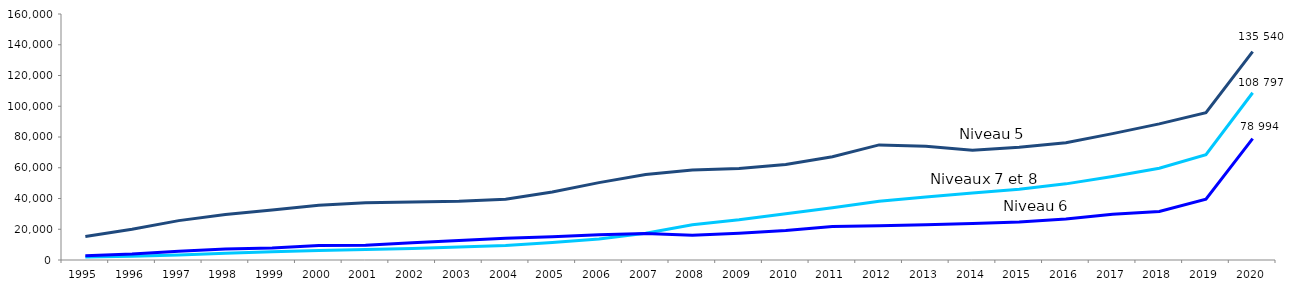
| Category | Niveaux 7 et 8 | Niveau 6 | Niveau 5 |
|---|---|---|---|
| 1995 | 1948 | 2829 | 15273 |
| 1996 | 2441 | 3916 | 19952 |
| 1997 | 3250 | 5768 | 25603 |
| 1998 | 4436 | 7143 | 29581 |
| 1999 | 5397 | 7780 | 32507 |
| 2000 | 6185 | 9448 | 35553 |
| 2001 | 6852 | 9568 | 37234 |
| 2002 | 7514 | 11243 | 37751 |
| 2003 | 8378 | 12674 | 38217 |
| 2004 | 9407 | 14124 | 39560 |
| 2005 | 11341 | 15063 | 44233 |
| 2006 | 13690 | 16461 | 50316 |
| 2007 | 17340 | 17198 | 55577 |
| 2008 | 22928 | 16021 | 58572 |
| 2009 | 26156 | 17387 | 59532 |
| 2010 | 30142 | 19189 | 62074 |
| 2011 | 33931 | 21762 | 67193 |
| 2012 | 38182 | 22321 | 74868 |
| 2013 | 41027 | 22937 | 74048 |
| 2014 | 43614 | 23743 | 71419 |
| 2015 | 46041 | 24655 | 73317 |
| 2016 | 49523 | 26605 | 76326 |
| 2017 | 54364 | 29740 | 82200 |
| 2018 | 59667 | 31582 | 88551 |
| 2019 | 68480 | 39506 | 95860 |
| 2020 | 108797 | 78994 | 135540 |